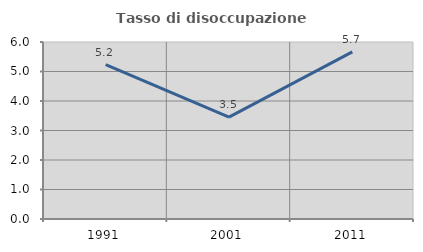
| Category | Tasso di disoccupazione giovanile  |
|---|---|
| 1991.0 | 5.234 |
| 2001.0 | 3.453 |
| 2011.0 | 5.666 |